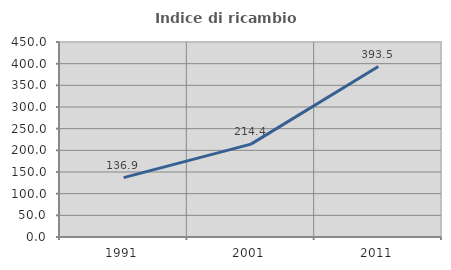
| Category | Indice di ricambio occupazionale  |
|---|---|
| 1991.0 | 136.927 |
| 2001.0 | 214.394 |
| 2011.0 | 393.458 |